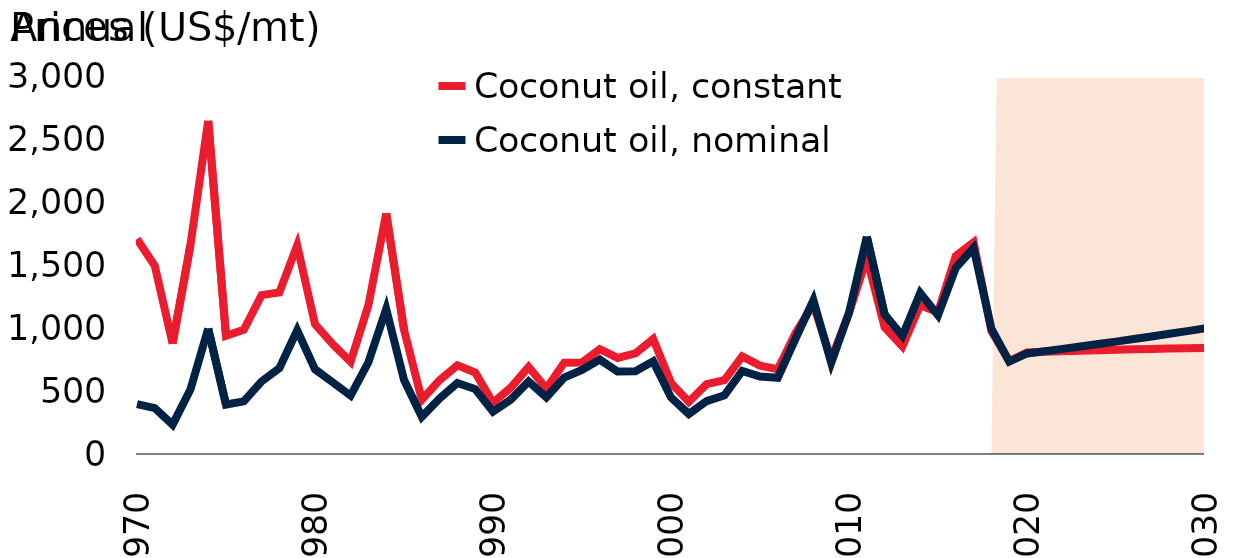
| Category | Coconut oil, constant | Coconut oil, nominal |
|---|---|---|
| 1970.0 | 1710.92 | 397.183 |
| 1971.0 | 1497.161 | 365.527 |
| 1972.0 | 878.846 | 234.06 |
| 1973.0 | 1660.914 | 513 |
| 1974.0 | 2650.332 | 997.583 |
| 1975.0 | 941.324 | 393.5 |
| 1976.0 | 988.988 | 418.5 |
| 1977.0 | 1263.965 | 578.167 |
| 1978.0 | 1285.247 | 683.208 |
| 1979.0 | 1660.241 | 984.5 |
| 1980.0 | 1033.101 | 673.833 |
| 1981.0 | 872.782 | 569.917 |
| 1982.0 | 733.051 | 464.417 |
| 1983.0 | 1183.443 | 729.875 |
| 1984.0 | 1914.205 | 1154.583 |
| 1985.0 | 988.759 | 590.167 |
| 1986.0 | 431.897 | 296.5 |
| 1987.0 | 587.862 | 442.25 |
| 1988.0 | 705.044 | 564.833 |
| 1989.0 | 649.018 | 516.833 |
| 1990.0 | 407.028 | 336.5 |
| 1991.0 | 528.615 | 433 |
| 1992.0 | 692.188 | 577.583 |
| 1993.0 | 521.59 | 450.25 |
| 1994.0 | 725.547 | 607.5 |
| 1995.0 | 728.441 | 669.583 |
| 1996.0 | 833.531 | 751.583 |
| 1997.0 | 764.452 | 656.833 |
| 1998.0 | 800.668 | 657.917 |
| 1999.0 | 914.593 | 737.083 |
| 2000.0 | 566.032 | 450.333 |
| 2001.0 | 415.378 | 318.083 |
| 2002.0 | 556.269 | 421 |
| 2003.0 | 586.97 | 467.333 |
| 2004.0 | 777.115 | 660.75 |
| 2005.0 | 703.476 | 616.979 |
| 2006.0 | 674.898 | 606.91 |
| 2007.0 | 962.881 | 918.875 |
| 2008.0 | 1190.269 | 1224 |
| 2009.0 | 751.979 | 725.375 |
| 2010.0 | 1123.583 | 1123.583 |
| 2011.0 | 1558.693 | 1730.083 |
| 2012.0 | 1008.243 | 1110.833 |
| 2013.0 | 856.441 | 939.469 |
| 2014.0 | 1183.842 | 1281.124 |
| 2015.0 | 1127.667 | 1103.512 |
| 2016.0 | 1575.794 | 1481.777 |
| 2017.0 | 1684.242 | 1639.127 |
| 2018.0 | 979.341 | 996.77 |
| 2019.0 | 739.511 | 735.651 |
| 2020.0 | 808.166 | 800 |
| 2021.0 | 813.409 | 818.052 |
| 2022.0 | 818.056 | 836.512 |
| 2023.0 | 822.249 | 855.388 |
| 2024.0 | 826.074 | 874.69 |
| 2025.0 | 829.586 | 894.427 |
| 2026.0 | 832.823 | 914.61 |
| 2027.0 | 835.812 | 935.248 |
| 2028.0 | 838.572 | 956.352 |
| 2029.0 | 841.117 | 977.933 |
| 2030.0 | 843.457 | 1000 |